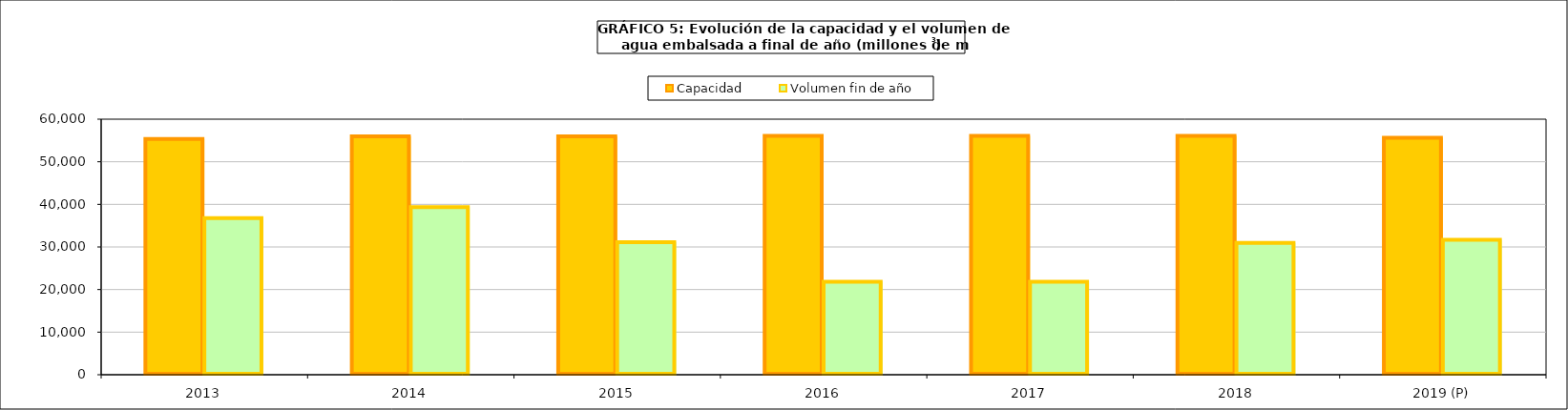
| Category | Capacidad | Volumen fin de año |
|---|---|---|
| 2013 | 55343 | 36761 |
| 2014 | 55977 | 39350 |
| 2015 | 55977 | 31121 |
| 2016 | 56075 | 21832 |
| 2017 | 56074 | 21832 |
| 2018 | 56074 | 30936 |
| 2019 (P) | 55622 | 31678 |